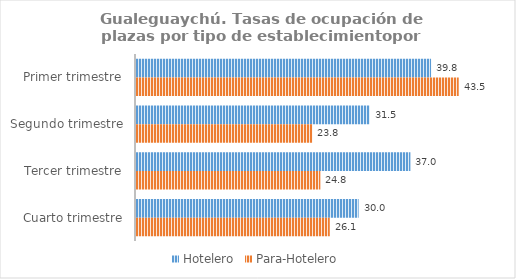
| Category | Hotelero | Para-Hotelero |
|---|---|---|
| Primer trimestre | 39.764 | 43.494 |
| Segundo trimestre | 31.499 | 23.768 |
| Tercer trimestre | 36.98 | 24.844 |
| Cuarto trimestre | 30.002 | 26.117 |